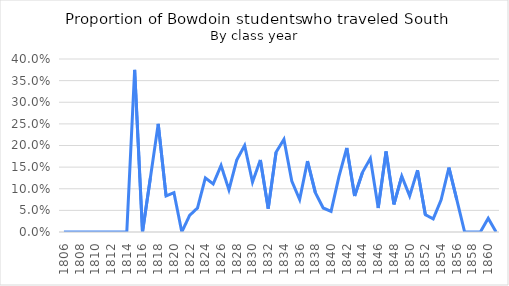
| Category | % of class year |
|---|---|
| 1806.0 | 0 |
| 1807.0 | 0 |
| 1808.0 | 0 |
| 1809.0 | 0 |
| 1810.0 | 0 |
| 1811.0 | 0 |
| 1812.0 | 0 |
| 1813.0 | 0 |
| 1814.0 | 0 |
| 1815.0 | 0.375 |
| 1816.0 | 0 |
| 1817.0 | 0.125 |
| 1818.0 | 0.25 |
| 1819.0 | 0.083 |
| 1820.0 | 0.091 |
| 1821.0 | 0 |
| 1822.0 | 0.038 |
| 1823.0 | 0.056 |
| 1824.0 | 0.125 |
| 1825.0 | 0.111 |
| 1826.0 | 0.154 |
| 1827.0 | 0.098 |
| 1828.0 | 0.167 |
| 1829.0 | 0.2 |
| 1830.0 | 0.115 |
| 1831.0 | 0.167 |
| 1832.0 | 0.054 |
| 1833.0 | 0.184 |
| 1834.0 | 0.214 |
| 1835.0 | 0.118 |
| 1836.0 | 0.075 |
| 1837.0 | 0.164 |
| 1838.0 | 0.091 |
| 1839.0 | 0.056 |
| 1840.0 | 0.048 |
| 1841.0 | 0.128 |
| 1842.0 | 0.194 |
| 1843.0 | 0.083 |
| 1844.0 | 0.138 |
| 1845.0 | 0.17 |
| 1846.0 | 0.056 |
| 1847.0 | 0.186 |
| 1848.0 | 0.064 |
| 1849.0 | 0.129 |
| 1850.0 | 0.083 |
| 1851.0 | 0.143 |
| 1852.0 | 0.04 |
| 1853.0 | 0.03 |
| 1854.0 | 0.074 |
| 1855.0 | 0.149 |
| 1856.0 | 0.075 |
| 1857.0 | 0 |
| 1858.0 | 0 |
| 1859.0 | 0 |
| 1860.0 | 0.032 |
| 1861.0 | 0 |